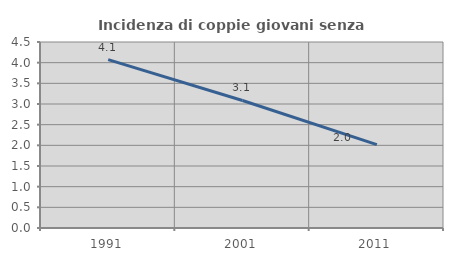
| Category | Incidenza di coppie giovani senza figli |
|---|---|
| 1991.0 | 4.074 |
| 2001.0 | 3.085 |
| 2011.0 | 2.016 |